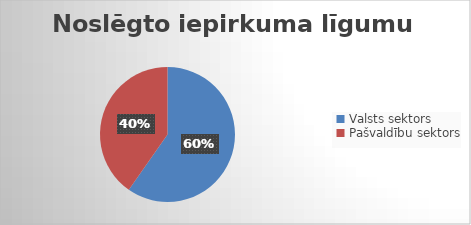
| Category | Noslēgto iepirkuma līgumu skaits |
|---|---|
| Valsts sektors | 449 |
| Pašvaldību sektors | 303 |